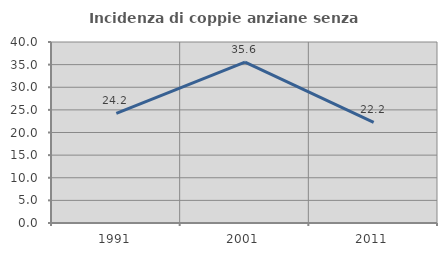
| Category | Incidenza di coppie anziane senza figli  |
|---|---|
| 1991.0 | 24.242 |
| 2001.0 | 35.556 |
| 2011.0 | 22.222 |